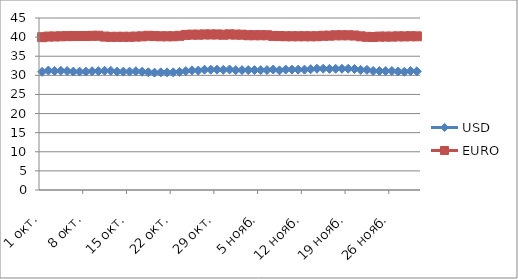
| Category | USD | EURO |
|---|---|---|
| 2012-10-01 | 30.917 | 39.979 |
| 2012-10-02 | 31.254 | 40.146 |
| 2012-10-03 | 31.135 | 40.167 |
| 2012-10-04 | 31.194 | 40.21 |
| 2012-10-05 | 31.121 | 40.258 |
| 2012-10-06 | 30.974 | 40.282 |
| 2012-10-07 | 30.974 | 40.282 |
| 2012-10-08 | 30.974 | 40.282 |
| 2012-10-09 | 31.078 | 40.339 |
| 2012-10-10 | 31.099 | 40.358 |
| 2012-10-11 | 31.202 | 40.135 |
| 2012-10-12 | 31.167 | 40.068 |
| 2012-10-13 | 30.974 | 40.083 |
| 2012-10-14 | 30.974 | 40.083 |
| 2012-10-15 | 30.974 | 40.083 |
| 2012-10-16 | 31.079 | 40.136 |
| 2012-10-17 | 30.949 | 40.197 |
| 2012-10-18 | 30.796 | 40.352 |
| 2012-10-19 | 30.72 | 40.264 |
| 2012-10-20 | 30.782 | 40.214 |
| 2012-10-21 | 30.782 | 40.214 |
| 2012-10-22 | 30.782 | 40.214 |
| 2012-10-23 | 30.908 | 40.342 |
| 2012-10-24 | 31.117 | 40.58 |
| 2012-10-25 | 31.304 | 40.654 |
| 2012-10-26 | 31.25 | 40.631 |
| 2012-10-27 | 31.478 | 40.695 |
| 2012-10-28 | 31.478 | 40.695 |
| 2012-10-29 | 31.478 | 40.695 |
| 2012-10-30 | 31.437 | 40.623 |
| 2012-10-31 | 31.525 | 40.715 |
| 2012-11-01 | 31.374 | 40.655 |
| 2012-11-02 | 31.367 | 40.632 |
| 2012-11-03 | 31.382 | 40.492 |
| 2012-11-04 | 31.382 | 40.492 |
| 2012-11-05 | 31.382 | 40.492 |
| 2012-11-06 | 31.382 | 40.492 |
| 2012-11-07 | 31.52 | 40.313 |
| 2012-11-08 | 31.303 | 40.275 |
| 2012-11-09 | 31.515 | 40.219 |
| 2012-11-10 | 31.496 | 40.224 |
| 2012-11-11 | 31.496 | 40.224 |
| 2012-11-12 | 31.496 | 40.224 |
| 2012-11-13 | 31.605 | 40.215 |
| 2012-11-14 | 31.716 | 40.232 |
| 2012-11-15 | 31.727 | 40.35 |
| 2012-11-16 | 31.692 | 40.382 |
| 2012-11-17 | 31.718 | 40.476 |
| 2012-11-18 | 31.718 | 40.476 |
| 2012-11-19 | 31.718 | 40.476 |
| 2012-11-20 | 31.668 | 40.421 |
| 2012-11-21 | 31.426 | 40.204 |
| 2012-11-22 | 31.422 | 40.078 |
| 2012-11-23 | 31.152 | 40.028 |
| 2012-11-24 | 31.132 | 40.136 |
| 2012-11-25 | 31.132 | 40.136 |
| 2012-11-26 | 31.132 | 40.136 |
| 2012-11-27 | 31.02 | 40.199 |
| 2012-11-28 | 30.941 | 40.189 |
| 2012-11-29 | 31.141 | 40.234 |
| 2012-11-30 | 31.056 | 40.206 |